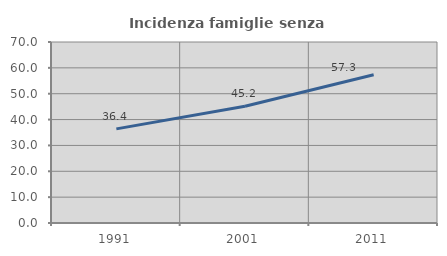
| Category | Incidenza famiglie senza nuclei |
|---|---|
| 1991.0 | 36.398 |
| 2001.0 | 45.151 |
| 2011.0 | 57.321 |